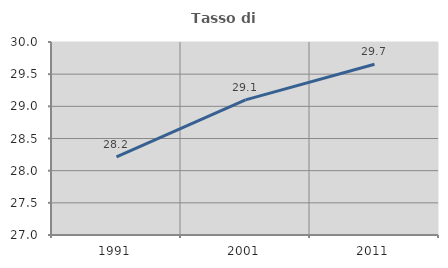
| Category | Tasso di occupazione   |
|---|---|
| 1991.0 | 28.215 |
| 2001.0 | 29.101 |
| 2011.0 | 29.655 |